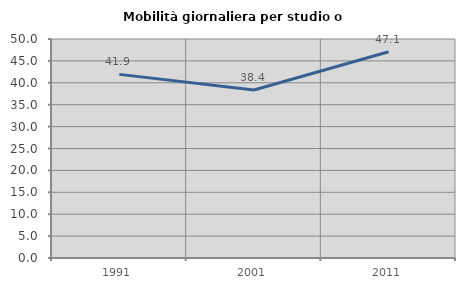
| Category | Mobilità giornaliera per studio o lavoro |
|---|---|
| 1991.0 | 41.922 |
| 2001.0 | 38.354 |
| 2011.0 | 47.095 |